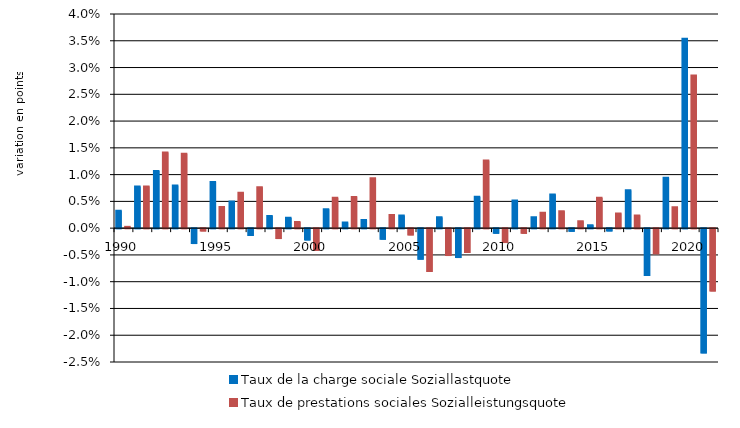
| Category | Taux de la charge sociale | Taux de prestations sociales |
|---|---|---|
| 1990.0 | 0.003 | 0 |
| 1991.0 | 0.008 | 0.008 |
| 1992.0 | 0.011 | 0.014 |
| 1993.0 | 0.008 | 0.014 |
| 1994.0 | -0.003 | 0 |
| 1995.0 | 0.009 | 0.004 |
| 1996.0 | 0.005 | 0.007 |
| 1997.0 | -0.001 | 0.008 |
| 1998.0 | 0.002 | -0.002 |
| 1999.0 | 0.002 | 0.001 |
| 2000.0 | -0.002 | -0.004 |
| 2001.0 | 0.004 | 0.006 |
| 2002.0 | 0.001 | 0.006 |
| 2003.0 | 0.002 | 0.009 |
| 2004.0 | -0.002 | 0.002 |
| 2005.0 | 0.002 | -0.001 |
| 2006.0 | -0.006 | -0.008 |
| 2007.0 | 0.002 | -0.005 |
| 2008.0 | -0.005 | -0.004 |
| 2009.0 | 0.006 | 0.013 |
| 2010.0 | -0.001 | -0.003 |
| 2011.0 | 0.005 | -0.001 |
| 2012.0 | 0.002 | 0.003 |
| 2013.0 | 0.006 | 0.003 |
| 2014.0 | -0.001 | 0.001 |
| 2015.0 | 0.001 | 0.006 |
| 2016.0 | 0 | 0.003 |
| 2017.0 | 0.007 | 0.002 |
| 2018.0 | -0.009 | -0.005 |
| 2019.0 | 0.009 | 0.004 |
| 2020.0 | 0.035 | 0.029 |
| 2021.0 | -0.023 | -0.012 |